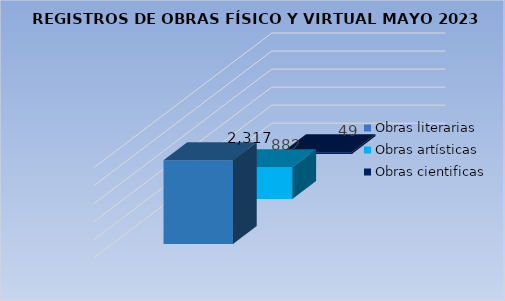
| Category | Obras literarias | Obras artísticas | Obras cientificas |
|---|---|---|---|
| Cantidad | 2317 | 882 | 49 |